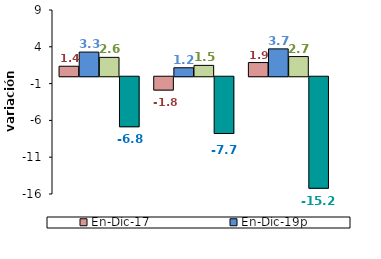
| Category | En-Dic-17 | En-Dic-19p | En-Dic-18 | En-Dic-20pr |
|---|---|---|---|---|
| 0 | 1.359 | 3.281 | 2.564 | -6.796 |
| 1 | -1.816 | 1.153 | 1.475 | -7.714 |
| 2 | 1.86 | 3.718 | 2.673 | -15.156 |